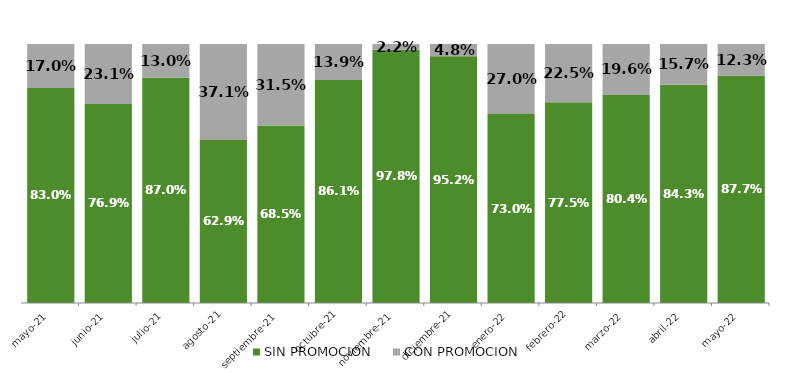
| Category | SIN PROMOCION   | CON PROMOCION   |
|---|---|---|
| 2021-05-01 | 0.83 | 0.17 |
| 2021-06-01 | 0.769 | 0.231 |
| 2021-07-01 | 0.87 | 0.13 |
| 2021-08-01 | 0.629 | 0.371 |
| 2021-09-01 | 0.685 | 0.315 |
| 2021-10-01 | 0.861 | 0.139 |
| 2021-11-01 | 0.978 | 0.022 |
| 2021-12-01 | 0.952 | 0.048 |
| 2022-01-01 | 0.73 | 0.27 |
| 2022-02-01 | 0.775 | 0.225 |
| 2022-03-01 | 0.804 | 0.196 |
| 2022-04-01 | 0.843 | 0.157 |
| 2022-05-01 | 0.877 | 0.123 |